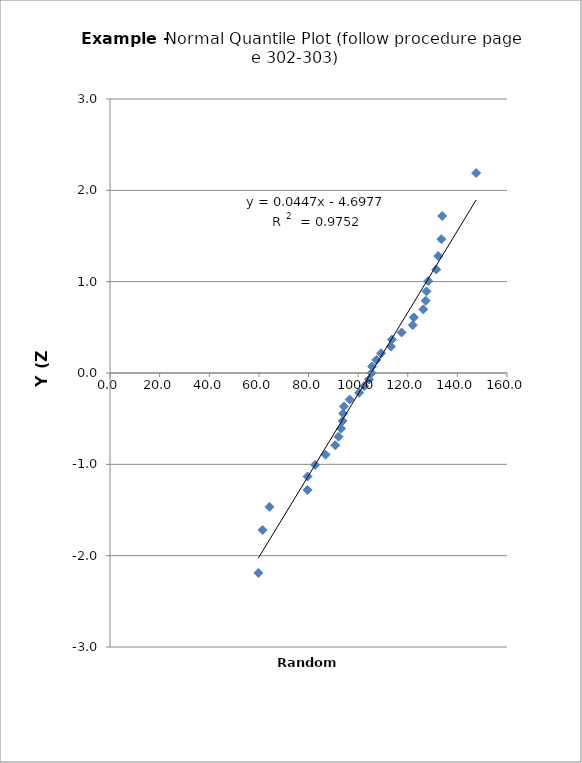
| Category | Y |
|---|---|
| 59.77510453224377 | -2.189 |
| 61.525712799301964 | -1.718 |
| 64.28632594158138 | -1.465 |
| 79.57176232266453 | -1.282 |
| 79.60279449679291 | -1.133 |
| 82.66204030740167 | -1.006 |
| 86.89362840220815 | -0.894 |
| 90.80172697554207 | -0.792 |
| 92.10913434965967 | -0.697 |
| 93.16386376779633 | -0.608 |
| 93.75921926080217 | -0.524 |
| 93.97120490985591 | -0.444 |
| 94.24347252432607 | -0.366 |
| 96.59309265567724 | -0.291 |
| 100.42580673832168 | -0.217 |
| 102.44008135586056 | -0.144 |
| 104.40639963472253 | -0.072 |
| 105.4509472012588 | 0 |
| 105.64886839834607 | 0.072 |
| 107.35846794003203 | 0.144 |
| 109.2405343309639 | 0.217 |
| 113.24198890501137 | 0.291 |
| 113.5979790360756 | 0.366 |
| 117.50923909364079 | 0.444 |
| 122.03413816467892 | 0.524 |
| 122.41358999164129 | 0.608 |
| 126.25007706757754 | 0.697 |
| 127.21887232716804 | 0.792 |
| 127.54474906845246 | 0.894 |
| 128.23412007946035 | 1.006 |
| 131.49505895559406 | 1.133 |
| 132.2665525892947 | 1.282 |
| 133.5241291056366 | 1.465 |
| 133.88286671191838 | 1.718 |
| 147.57484899574015 | 2.189 |